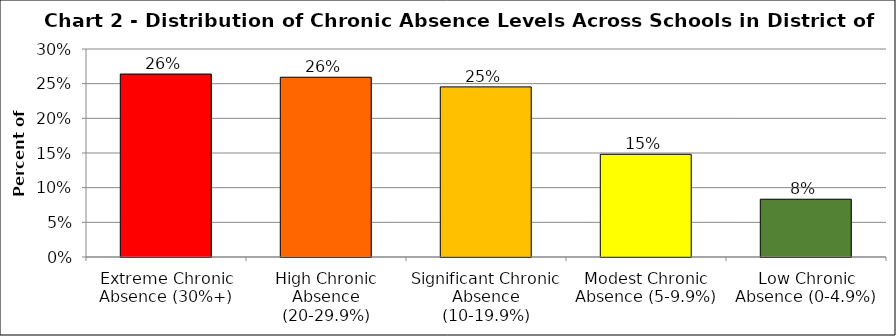
| Category | Series 1 |
|---|---|
| Extreme Chronic Absence (30%+) | 0.264 |
| High Chronic Absence (20-29.9%) | 0.259 |
| Significant Chronic Absence (10-19.9%) | 0.245 |
| Modest Chronic Absence (5-9.9%) | 0.148 |
| Low Chronic Absence (0-4.9%) | 0.083 |